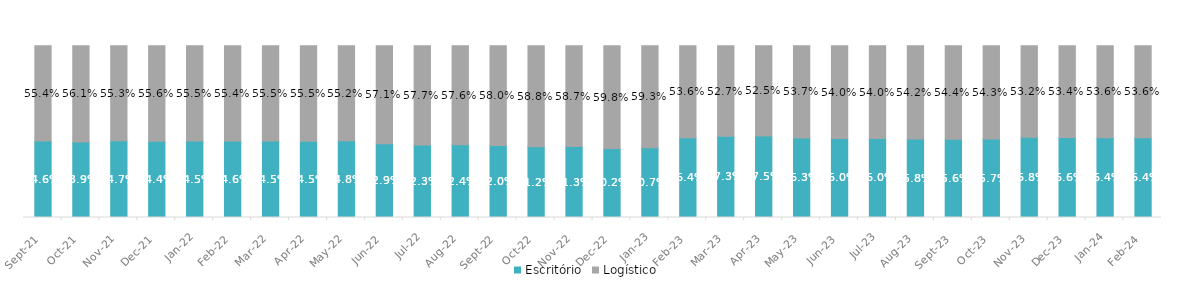
| Category | Escritório | Logístico |
|---|---|---|
| 2021-09-01 | 0.446 | 0.554 |
| 2021-10-01 | 0.439 | 0.561 |
| 2021-11-01 | 0.447 | 0.553 |
| 2021-12-01 | 0.444 | 0.556 |
| 2022-01-01 | 0.445 | 0.555 |
| 2022-02-01 | 0.446 | 0.554 |
| 2022-03-01 | 0.445 | 0.555 |
| 2022-04-01 | 0.445 | 0.555 |
| 2022-05-01 | 0.448 | 0.552 |
| 2022-06-01 | 0.429 | 0.571 |
| 2022-07-31 | 0.423 | 0.577 |
| 2022-08-31 | 0.424 | 0.576 |
| 2022-09-01 | 0.42 | 0.58 |
| 2022-10-01 | 0.412 | 0.588 |
| 2022-11-01 | 0.413 | 0.587 |
| 2022-12-01 | 0.402 | 0.598 |
| 2023-01-01 | 0.407 | 0.593 |
| 2023-02-01 | 0.464 | 0.536 |
| 2023-03-01 | 0.473 | 0.527 |
| 2023-04-01 | 0.475 | 0.525 |
| 2023-05-01 | 0.463 | 0.537 |
| 2023-06-01 | 0.46 | 0.54 |
| 2023-07-01 | 0.46 | 0.54 |
| 2023-08-01 | 0.458 | 0.542 |
| 2023-09-01 | 0.456 | 0.544 |
| 2023-10-01 | 0.457 | 0.543 |
| 2023-11-01 | 0.468 | 0.532 |
| 2023-12-01 | 0.466 | 0.534 |
| 2024-01-01 | 0.464 | 0.536 |
| 2024-02-01 | 0.464 | 0.536 |